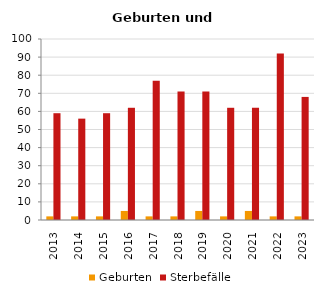
| Category | Geburten | Sterbefälle |
|---|---|---|
| 2013.0 | 2 | 59 |
| 2014.0 | 2 | 56 |
| 2015.0 | 2 | 59 |
| 2016.0 | 5 | 62 |
| 2017.0 | 2 | 77 |
| 2018.0 | 2 | 71 |
| 2019.0 | 5 | 71 |
| 2020.0 | 2 | 62 |
| 2021.0 | 5 | 62 |
| 2022.0 | 2 | 92 |
| 2023.0 | 2 | 68 |